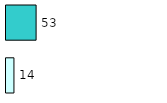
| Category | Series 0 | Series 1 |
|---|---|---|
| 0 | 14 | 53 |